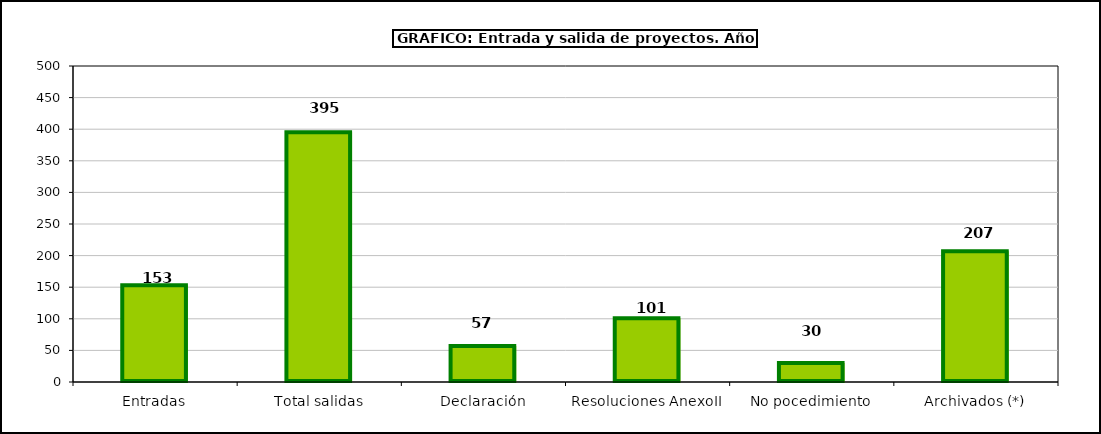
| Category | Total |
|---|---|
| 0 | 153 |
| 1 | 395 |
| 2 | 57 |
| 3 | 101 |
| 4 | 30 |
| 5 | 207 |